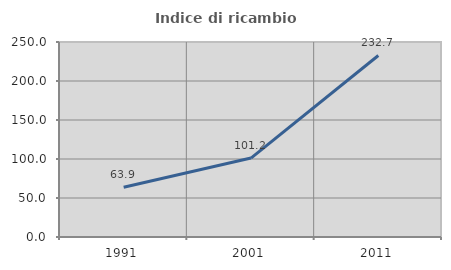
| Category | Indice di ricambio occupazionale  |
|---|---|
| 1991.0 | 63.881 |
| 2001.0 | 101.19 |
| 2011.0 | 232.704 |